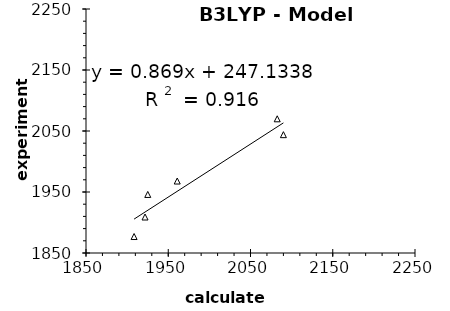
| Category | B3LYP |
|---|---|
| 1908.459119496855 | 1877 |
| 1921.782389937107 | 1909 |
| 1925.11320754717 | 1946 |
| 1960.919496855346 | 1968 |
| 2089.988679245283 | 2044 |
| 2082.494339622642 | 2070 |